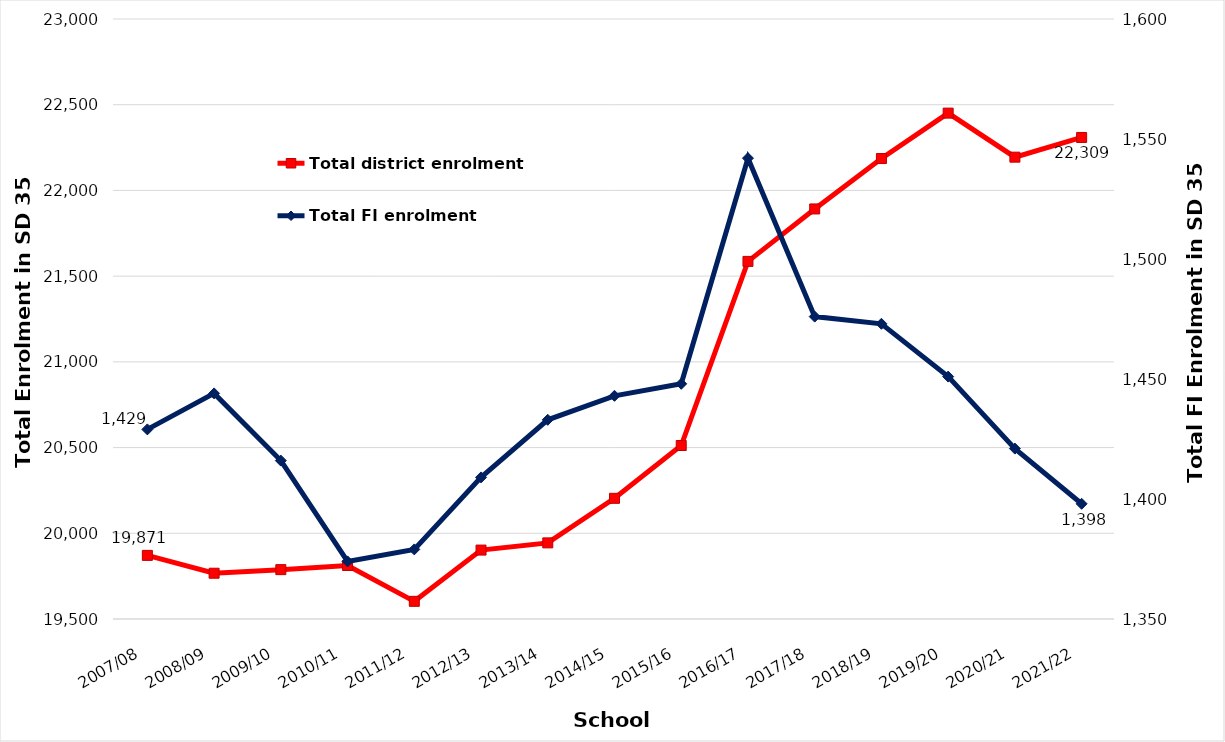
| Category | Total district enrolment  |
|---|---|
| 2007/08 | 19871 |
| 2008/09 | 19767 |
| 2009/10 | 19788 |
| 2010/11 | 19812 |
| 2011/12 | 19603 |
| 2012/13 | 19902 |
| 2013/14 | 19944 |
| 2014/15 | 20204 |
| 2015/16 | 20512 |
| 2016/17 | 21586 |
| 2017/18 | 21892 |
| 2018/19 | 22186 |
| 2019/20 | 22451 |
| 2020/21 | 22194 |
| 2021/22 | 22309 |